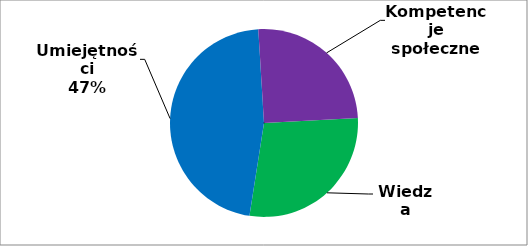
| Category | Series 0 |
|---|---|
| 0 | 107 |
| 1 | 176 |
| 2 | 95 |